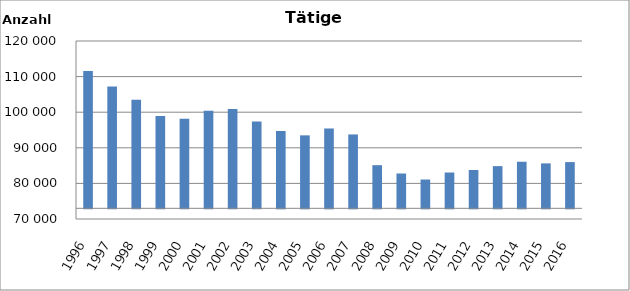
| Category | Series 0 |
|---|---|
| 1996.0 | 111544 |
| 1997.0 | 107253 |
| 1998.0 | 103463 |
| 1999.0 | 98926 |
| 2000.0 | 98154 |
| 2001.0 | 100422 |
| 2002.0 | 100868 |
| 2003.0 | 97367 |
| 2004.0 | 94725 |
| 2005.0 | 93496 |
| 2006.0 | 95427 |
| 2007.0 | 93755 |
| 2008.0 | 85118 |
| 2009.0 | 82782 |
| 2010.0 | 81089 |
| 2011.0 | 83058 |
| 2012.0 | 83766 |
| 2013.0 | 84853 |
| 2014.0 | 86087 |
| 2015.0 | 85622 |
| 2016.0 | 85986 |